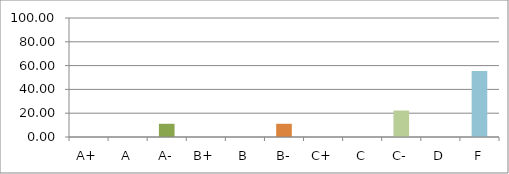
| Category | Series 0 |
|---|---|
| A+ | 0 |
| A | 0 |
| A- | 11.111 |
| B+ | 0 |
| B | 0 |
| B- | 11.111 |
| C+ | 0 |
| C | 0 |
| C- | 22.222 |
| D | 0 |
| F | 55.556 |